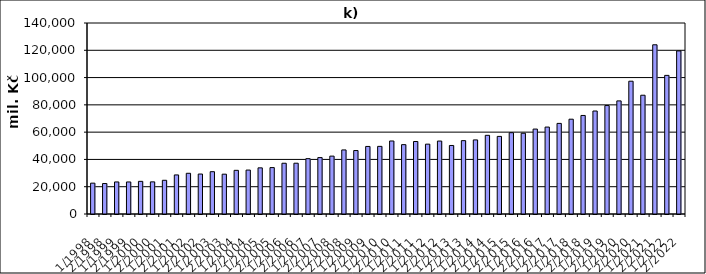
| Category | Series 0 |
|---|---|
| 1/1998 | 22612053.945 |
| 2/1998 | 22324147.545 |
| 1/1999 | 23498902.429 |
| 2/1999 | 23480117.571 |
| 1/2000 | 23931635.368 |
| 2/2000 | 23552446.932 |
| 1/2001 | 24714687.997 |
| 2/2001 | 28643096.708 |
| 1/2002 | 29843588 |
| 2/2002 | 29296127 |
| 1/2003 | 31009529 |
| 2/2003 | 29183260.099 |
| 1/2004 | 32007329.107 |
| 2/2004 | 32198891 |
| 1/2005 | 33822355 |
| 2/2005 | 34026417.794 |
| 1/2006 | 37200339 |
| 2/2006 | 37224064 |
| 1/2007 | 40563572 |
| 2/2007 | 41353196 |
| 1/2008 | 42430605.257 |
| 2/2008 | 46963746.743 |
| 1/2009 | 46516575.12 |
| 2/2009 | 49514710 |
| 1/2010 | 49579307 |
| 2/2010 | 53513867 |
| 1/2011 | 50830634 |
| 2/2011 | 53140892 |
| 1/2012 | 51201166 |
| 2/2012 | 53472635 |
| 1/2013 | 50230974 |
| 2/2013 | 53766872 |
| 1/2014 | 54306637 |
| 2/2014 | 57673803 |
| 1/2015 | 56883064 |
| 2/2015 | 59597039 |
| 1/2016 | 59190759 |
| 2/2016 | 62256486 |
| 1/2017 | 63721989 |
| 2/2017 | 66410452 |
| 1/2018 | 69487350.594 |
| 2/2018 | 72230913.249 |
| 1/2019 | 75492514.512 |
| 2/2019 | 79485458.054 |
| 1/2020 | 82905611.079 |
| 2/2020 | 97335774.921 |
| 1/2021 | 87061768.943 |
| 2/2021 | 124034344.573 |
| 1/2022 | 101599621.08 |
| 2/2022 | 119542651.128 |